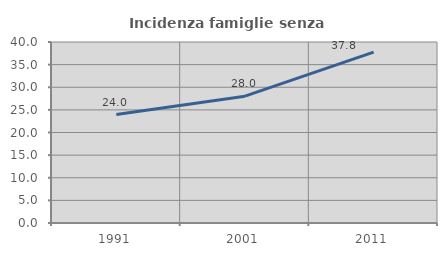
| Category | Incidenza famiglie senza nuclei |
|---|---|
| 1991.0 | 23.958 |
| 2001.0 | 28.022 |
| 2011.0 | 37.766 |